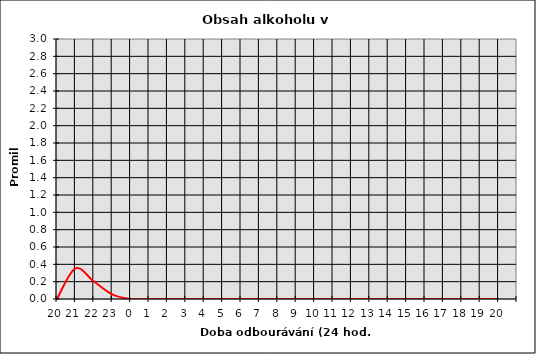
| Category | Series 0 | Series 1 |
|---|---|---|
| 20.0 | 0 |  |
| 21.0 | 0.353 |  |
| 22.0 | 0.203 |  |
| 23.0 | 0.053 |  |
| 0.0 | 0 |  |
| 1.0 | 0 |  |
| 2.0 | 0 |  |
| 3.0 | 0 |  |
| 4.0 | 0 |  |
| 5.0 | 0 |  |
| 6.0 | 0 |  |
| 7.0 | 0 |  |
| 8.0 | 0 |  |
| 9.0 | 0 |  |
| 10.0 | 0 |  |
| 11.0 | 0 |  |
| 12.0 | 0 |  |
| 13.0 | 0 |  |
| 14.0 | 0 |  |
| 15.0 | 0 |  |
| 16.0 | 0 |  |
| 17.0 | 0 |  |
| 18.0 | 0 |  |
| 19.0 | 0 |  |
| 20.0 | 0 |  |